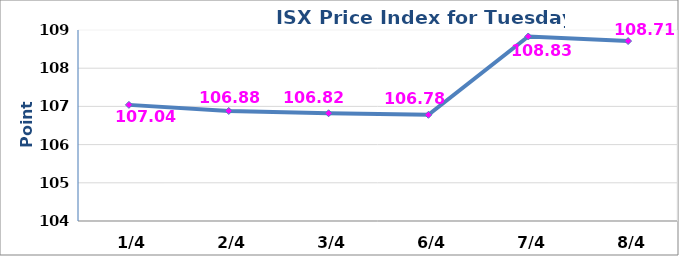
| Category | 2014 |
|---|---|
|  1/4 | 107.04 |
|  2/4 | 106.88 |
|  3/4 | 106.82 |
|  6/4 | 106.78 |
|  7/4 | 108.83 |
|  8/4 | 108.71 |